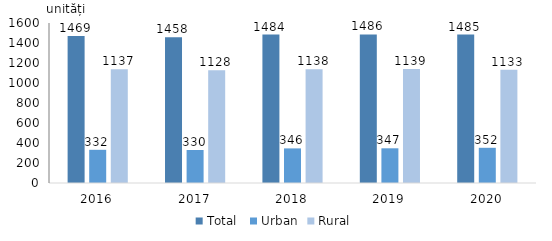
| Category | Total  | Urban | Rural |
|---|---|---|---|
| 2016.0 | 1469 | 332 | 1137 |
| 2017.0 | 1458 | 330 | 1128 |
| 2018.0 | 1484 | 346 | 1138 |
| 2019.0 | 1486 | 347 | 1139 |
| 2020.0 | 1485 | 352 | 1133 |